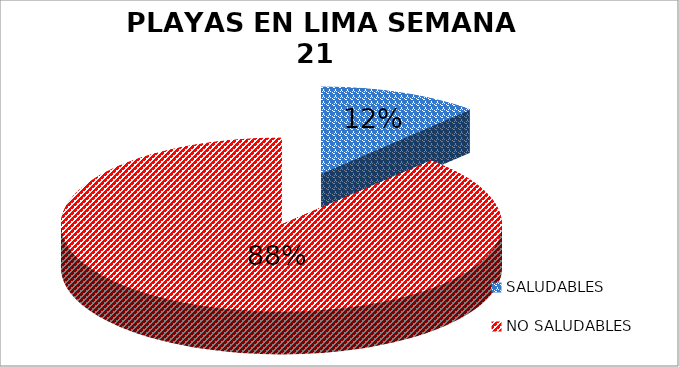
| Category | N.° |
|---|---|
| SALUDABLES | 6 |
| NO SALUDABLES | 45 |